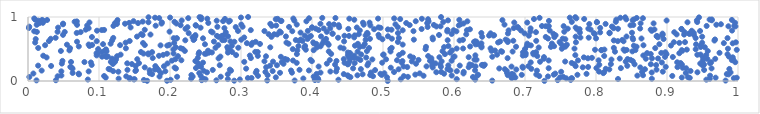
| Category | Series 0 |
|---|---|
| 0.5066446792424749 | 0.001 |
| 0.7273390573005676 | 0.002 |
| 0.16776289051425142 | 0.003 |
| 0.19573983436743414 | 0.004 |
| 0.29044077627068376 | 0.005 |
| 0.6538460944912292 | 0.006 |
| 0.9825186861008528 | 0.007 |
| 0.3755370394606483 | 0.008 |
| 0.33699287710838477 | 0.009 |
| 0.01194620038154881 | 0.01 |
| 0.2653430936081671 | 0.011 |
| 0.03927846956264036 | 0.012 |
| 0.24469687878315727 | 0.013 |
| 0.746077350351974 | 0.014 |
| 0.40414652269213147 | 0.015 |
| 0.16319884785727035 | 0.016 |
| 0.7644951884384839 | 0.017 |
| 0.4089043672790691 | 0.018 |
| 0.2008756063524304 | 0.019 |
| 0.4372411225565269 | 0.02 |
| 0.9554166714827125 | 0.021 |
| 0.6298650176584266 | 0.022 |
| 0.08425860920061146 | 0.023 |
| 0.2983270029154491 | 0.024 |
| 0.14890320591030903 | 0.025 |
| 0.2500699769613106 | 0.026 |
| 0.5250334935101109 | 0.027 |
| 0.15013411242525554 | 0.028 |
| 0.6038917195047535 | 0.029 |
| 0.2814680900191767 | 0.03 |
| 0.8310206023150317 | 0.031 |
| 0.24759962955820736 | 0.032 |
| 0.14331621828558905 | 0.033 |
| 0.9601874281692051 | 0.034 |
| 0.8786223196855039 | 0.035 |
| 0.2297935473833338 | 0.036 |
| 0.1276690582118598 | 0.037 |
| 0.40849363384227866 | 0.038 |
| 0.38779549427072124 | 0.039 |
| 0.4062977833347422 | 0.04 |
| 0.7663090196332922 | 0.041 |
| 0.7581445398009405 | 0.042 |
| 0.7652250684037771 | 0.043 |
| 0.9941757080983294 | 0.044 |
| 0.1435952344699306 | 0.045 |
| 0.30968935304764267 | 0.046 |
| 0.31484541788683973 | 0.047 |
| 0.6811626801923677 | 0.048 |
| 0.9320745420388422 | 0.049 |
| 0.681727538317934 | 0.05 |
| 0.9982168928025423 | 0.051 |
| 0.9684672303360656 | 0.052 |
| 0.10945854293022284 | 0.053 |
| 0.9208655562788824 | 0.054 |
| 0.6864111518455834 | 0.055 |
| 0.7493346206057587 | 0.056 |
| 0.3490254090131648 | 0.057 |
| 0.505668191982686 | 0.058 |
| 0.9295750750005789 | 0.059 |
| 0.45414590903095786 | 0.06 |
| 0.6839381165811463 | 0.061 |
| 0.6267160099842705 | 0.062 |
| 0.001868504858891673 | 0.063 |
| 0.7539017172345731 | 0.064 |
| 0.5350890880030333 | 0.065 |
| 0.210011848797527 | 0.066 |
| 0.27146671039300196 | 0.067 |
| 0.40237011536257916 | 0.068 |
| 0.23190699428273653 | 0.069 |
| 0.1852315613828701 | 0.07 |
| 0.7323137278850017 | 0.071 |
| 0.4516108924789073 | 0.072 |
| 0.13840816620710217 | 0.073 |
| 0.04176832630698213 | 0.074 |
| 0.48592455643939203 | 0.075 |
| 0.5292764622721047 | 0.076 |
| 0.7200453761332853 | 0.077 |
| 0.10723330296901679 | 0.078 |
| 0.9074343015615656 | 0.079 |
| 0.32391550002540737 | 0.08 |
| 0.2433040251883608 | 0.081 |
| 0.5571159827588731 | 0.082 |
| 0.960668770312429 | 0.083 |
| 0.85827427852476 | 0.084 |
| 0.5967517667747605 | 0.085 |
| 0.04701324106146021 | 0.086 |
| 0.633065654290535 | 0.087 |
| 0.4501860503261651 | 0.088 |
| 0.4639756894507969 | 0.089 |
| 0.8662247177588303 | 0.09 |
| 0.337540017594683 | 0.091 |
| 0.6757094214583751 | 0.092 |
| 0.48202335819765774 | 0.093 |
| 0.23013587788506018 | 0.094 |
| 0.49821351323179286 | 0.095 |
| 0.6954477470842665 | 0.096 |
| 0.7738396002152772 | 0.097 |
| 0.6338358389105777 | 0.098 |
| 0.7404611887689406 | 0.099 |
| 0.5454860753634302 | 0.1 |
| 0.6836571747971025 | 0.101 |
| 0.7159278307020469 | 0.102 |
| 0.9867426610185427 | 0.103 |
| 0.07177576262022567 | 0.104 |
| 0.4712785955822376 | 0.105 |
| 0.2814252874871509 | 0.106 |
| 0.17472905914089398 | 0.107 |
| 0.44476772845468016 | 0.108 |
| 0.9842635687466981 | 0.109 |
| 0.40646540025405153 | 0.11 |
| 0.6815416020776138 | 0.111 |
| 0.7866616285747374 | 0.112 |
| 0.4963366398540644 | 0.113 |
| 0.586090793669019 | 0.114 |
| 0.07135853077114496 | 0.115 |
| 0.7426915772376004 | 0.116 |
| 0.007556343038463531 | 0.117 |
| 0.613330974524838 | 0.118 |
| 0.5516626523036803 | 0.119 |
| 0.17163072117110567 | 0.12 |
| 0.5019431785040644 | 0.121 |
| 0.18712211110612864 | 0.122 |
| 0.8102342820954125 | 0.123 |
| 0.2412313967484927 | 0.124 |
| 0.9265096778069871 | 0.125 |
| 0.06285966942617549 | 0.126 |
| 0.6746241008472221 | 0.127 |
| 0.35497160644935477 | 0.128 |
| 0.3207902765297074 | 0.129 |
| 0.37179267001185523 | 0.13 |
| 0.4120032878512333 | 0.131 |
| 0.48305721678366087 | 0.132 |
| 0.8784924606128037 | 0.133 |
| 0.9895399989996465 | 0.134 |
| 0.2521100520315289 | 0.135 |
| 0.942860178151137 | 0.136 |
| 0.5750911588996925 | 0.137 |
| 0.8114540992827627 | 0.138 |
| 0.8649062898015286 | 0.139 |
| 0.5155718317737858 | 0.14 |
| 0.33438760726540373 | 0.141 |
| 0.5818978576536081 | 0.142 |
| 0.6136898279331996 | 0.143 |
| 0.750943592186474 | 0.144 |
| 0.1272373578906416 | 0.145 |
| 0.8940866545384452 | 0.146 |
| 0.804229874309525 | 0.147 |
| 0.42591316590142747 | 0.148 |
| 0.43404503386161697 | 0.149 |
| 0.08544191655433997 | 0.15 |
| 0.04696007283083392 | 0.151 |
| 0.19343872847261678 | 0.152 |
| 0.6040043836877006 | 0.153 |
| 0.11993906018542522 | 0.154 |
| 0.34458138866570387 | 0.155 |
| 0.15122878641881565 | 0.156 |
| 0.9331581704927355 | 0.157 |
| 0.32197307523152374 | 0.158 |
| 0.6742840137181568 | 0.159 |
| 0.24739693596285572 | 0.16 |
| 0.2859453511533846 | 0.161 |
| 0.7168477036713004 | 0.162 |
| 0.01925896798750537 | 0.163 |
| 0.3704866244195856 | 0.164 |
| 0.3956600866915918 | 0.165 |
| 0.594998570896817 | 0.166 |
| 0.6296578300003991 | 0.167 |
| 0.1712404417608402 | 0.168 |
| 0.1520776758373229 | 0.169 |
| 0.18379822052206662 | 0.17 |
| 0.48884921285463645 | 0.171 |
| 0.9522967789079255 | 0.172 |
| 0.2602061402057544 | 0.173 |
| 0.1400647880080479 | 0.174 |
| 0.3824017976276288 | 0.175 |
| 0.5933210565499525 | 0.176 |
| 0.8852476092404387 | 0.177 |
| 0.28428494951463756 | 0.178 |
| 0.17852444796546463 | 0.179 |
| 0.6877591771878087 | 0.18 |
| 0.8187317726430771 | 0.181 |
| 0.1153081889796036 | 0.182 |
| 0.5220120245135024 | 0.183 |
| 0.8689772737522852 | 0.184 |
| 0.6715807684863099 | 0.185 |
| 0.4688374046488979 | 0.186 |
| 0.5908815848664133 | 0.187 |
| 0.9878003045750982 | 0.188 |
| 0.11355861888170882 | 0.189 |
| 0.70896384214218 | 0.19 |
| 0.8138328351109784 | 0.191 |
| 0.06272512630599325 | 0.192 |
| 0.30725301568074914 | 0.193 |
| 0.4351104220692462 | 0.194 |
| 0.20838528188316263 | 0.195 |
| 0.663755923534183 | 0.196 |
| 0.962749520584084 | 0.197 |
| 0.45788233173377846 | 0.198 |
| 0.9270493445339129 | 0.199 |
| 0.733333602307708 | 0.2 |
| 0.8350410933890694 | 0.201 |
| 0.8005650457024209 | 0.202 |
| 0.2366015330946054 | 0.203 |
| 0.18103554403813849 | 0.204 |
| 0.1809747305432292 | 0.205 |
| 0.9221145018574771 | 0.206 |
| 0.6969911628328058 | 0.207 |
| 0.5109477257106325 | 0.208 |
| 0.061569410516785994 | 0.209 |
| 0.20646960958938487 | 0.21 |
| 0.570022856068835 | 0.211 |
| 0.8624011761005338 | 0.212 |
| 0.1644345430552221 | 0.213 |
| 0.7813440898352819 | 0.214 |
| 0.33545369919358625 | 0.215 |
| 0.6207332259572415 | 0.216 |
| 0.914729628943939 | 0.217 |
| 0.5341717325119572 | 0.218 |
| 0.7889229007456359 | 0.219 |
| 0.0596394001056737 | 0.22 |
| 0.898248034352133 | 0.221 |
| 0.5815760674291047 | 0.222 |
| 0.243662697134847 | 0.223 |
| 0.6964887699904313 | 0.224 |
| 0.681012325205352 | 0.225 |
| 0.4093524436340923 | 0.226 |
| 0.5289394264803136 | 0.227 |
| 0.5612949333140319 | 0.228 |
| 0.6303574126336502 | 0.229 |
| 0.19143523304159593 | 0.23 |
| 0.7048009663798915 | 0.231 |
| 0.7713231227124417 | 0.232 |
| 0.17933531638225375 | 0.233 |
| 0.1516897377780534 | 0.234 |
| 0.032553593693781524 | 0.235 |
| 0.6419075141974172 | 0.236 |
| 0.8440700741929386 | 0.237 |
| 0.2414340603918601 | 0.238 |
| 0.3408967323225641 | 0.239 |
| 0.014287832474959683 | 0.24 |
| 0.6081033115672027 | 0.241 |
| 0.5691771487525955 | 0.242 |
| 0.950081062320698 | 0.243 |
| 0.5919836605650953 | 0.244 |
| 0.47808729011179396 | 0.245 |
| 0.35067770140061805 | 0.246 |
| 0.2700392738551003 | 0.247 |
| 0.6251596722205154 | 0.248 |
| 0.8847465459770916 | 0.249 |
| 0.6392556139248524 | 0.25 |
| 0.08968975944646451 | 0.251 |
| 0.6405914966803695 | 0.252 |
| 0.8045906233853732 | 0.253 |
| 0.921101703102941 | 0.254 |
| 0.6433011156156342 | 0.255 |
| 0.43247073897172306 | 0.256 |
| 0.9522201913490459 | 0.257 |
| 0.5806512872119546 | 0.258 |
| 0.6219515962119994 | 0.259 |
| 0.45022915069488956 | 0.26 |
| 0.8543453775848828 | 0.261 |
| 0.8772473672455228 | 0.262 |
| 0.769413123429886 | 0.263 |
| 0.8209566114131153 | 0.264 |
| 0.14633286901343445 | 0.265 |
| 0.1195658573668652 | 0.266 |
| 0.4512269323418603 | 0.267 |
| 0.5704154062016018 | 0.268 |
| 0.35988230678578903 | 0.269 |
| 0.546541101680259 | 0.27 |
| 0.4209100487310875 | 0.271 |
| 0.04767360420426836 | 0.272 |
| 0.9468602472957025 | 0.273 |
| 0.19646253762743682 | 0.274 |
| 0.5739219097161354 | 0.275 |
| 0.13977040086836456 | 0.276 |
| 0.47941685263915756 | 0.277 |
| 0.9606022570169229 | 0.278 |
| 0.15632462148216597 | 0.279 |
| 0.4601046823266567 | 0.28 |
| 0.9191190232642124 | 0.281 |
| 0.7658126154613926 | 0.282 |
| 0.2389434195497082 | 0.283 |
| 0.37844482076345876 | 0.284 |
| 0.44584275057780787 | 0.285 |
| 0.4988572381647429 | 0.286 |
| 0.2464971539608115 | 0.287 |
| 0.5262076917837041 | 0.288 |
| 0.892793550522042 | 0.289 |
| 0.08856863803156345 | 0.29 |
| 0.70806515356506 | 0.291 |
| 0.9143658204339611 | 0.292 |
| 0.9621728372608048 | 0.293 |
| 0.9960698235111503 | 0.294 |
| 0.35749557488936246 | 0.295 |
| 0.07950077107866482 | 0.296 |
| 0.06061979462900813 | 0.297 |
| 0.11670403781150485 | 0.298 |
| 0.3045563427930029 | 0.299 |
| 0.12259798532788191 | 0.3 |
| 0.7212221894134042 | 0.301 |
| 0.8418479505390819 | 0.302 |
| 0.34511009314675867 | 0.303 |
| 0.7566050380898666 | 0.304 |
| 0.45286804870895214 | 0.305 |
| 0.5406781278030168 | 0.306 |
| 0.5826243597877689 | 0.307 |
| 0.3330208292842589 | 0.308 |
| 0.85194386071405 | 0.309 |
| 0.3998705838500276 | 0.31 |
| 0.5273628197172201 | 0.311 |
| 0.23573183690154753 | 0.312 |
| 0.4344744657366546 | 0.313 |
| 0.04851689523736358 | 0.314 |
| 0.5662017600523298 | 0.315 |
| 0.9503949983854509 | 0.316 |
| 0.596605208253426 | 0.317 |
| 0.20282667267578558 | 0.318 |
| 0.5683064713816885 | 0.319 |
| 0.3732948255809836 | 0.32 |
| 0.7333465014255738 | 0.321 |
| 0.7746264754653577 | 0.322 |
| 0.8036892668926024 | 0.323 |
| 0.21599065243435833 | 0.324 |
| 0.5197710565505321 | 0.325 |
| 0.9914006195148193 | 0.326 |
| 0.42502262046447514 | 0.327 |
| 0.46815499099689695 | 0.328 |
| 0.5500569167921423 | 0.329 |
| 0.8488048600118625 | 0.33 |
| 0.3979932286620047 | 0.331 |
| 0.36518093670884166 | 0.332 |
| 0.631711932076234 | 0.333 |
| 0.6288532331101565 | 0.334 |
| 0.8217588864818838 | 0.335 |
| 0.993218093467936 | 0.336 |
| 0.4850030429812868 | 0.337 |
| 0.12405078749246212 | 0.338 |
| 0.5043687549939835 | 0.339 |
| 0.20760321352131483 | 0.34 |
| 0.1539045424151334 | 0.341 |
| 0.44480001922601586 | 0.342 |
| 0.84450127498653 | 0.343 |
| 0.36212133634510524 | 0.344 |
| 0.9568628698325279 | 0.345 |
| 0.9678955611914791 | 0.346 |
| 0.7263777537082219 | 0.347 |
| 0.8702254092346597 | 0.348 |
| 0.11836486514650013 | 0.349 |
| 0.46442847436865753 | 0.35 |
| 0.8334703916891926 | 0.351 |
| 0.8873911960996209 | 0.352 |
| 0.26841919147271986 | 0.353 |
| 0.8788172761675963 | 0.354 |
| 0.7886220926703424 | 0.355 |
| 0.5680913758141868 | 0.356 |
| 0.6754802089642005 | 0.357 |
| 0.3139108536976599 | 0.358 |
| 0.17565987208567213 | 0.359 |
| 0.45506709994818995 | 0.36 |
| 0.2391959613614162 | 0.361 |
| 0.7942755109107145 | 0.362 |
| 0.4525073771246628 | 0.363 |
| 0.459331136686577 | 0.364 |
| 0.5425893783935 | 0.365 |
| 0.9507018681509537 | 0.366 |
| 0.47633946495215074 | 0.367 |
| 0.02622106495484866 | 0.368 |
| 0.7829025353242586 | 0.369 |
| 0.9925743818068059 | 0.37 |
| 0.5794311765411575 | 0.371 |
| 0.620690556017898 | 0.372 |
| 0.7267385514119467 | 0.373 |
| 0.599271991842604 | 0.374 |
| 0.9082086300006845 | 0.375 |
| 0.1103985387754296 | 0.376 |
| 0.8971627830533135 | 0.377 |
| 0.3561977000773857 | 0.378 |
| 0.6539345759486037 | 0.379 |
| 0.10430010258838751 | 0.38 |
| 0.2709918451830782 | 0.381 |
| 0.9871211816144527 | 0.382 |
| 0.6007798196379758 | 0.383 |
| 0.11236692617642985 | 0.384 |
| 0.5383461511094119 | 0.385 |
| 0.335209448752566 | 0.386 |
| 0.1254013199561168 | 0.387 |
| 0.21128909309891908 | 0.388 |
| 0.7172613695538003 | 0.389 |
| 0.5636043959136631 | 0.39 |
| 0.8115753751103071 | 0.391 |
| 0.32370503920134497 | 0.392 |
| 0.10938295902384276 | 0.393 |
| 0.18449656456134012 | 0.394 |
| 0.021502578598551647 | 0.395 |
| 0.45939662215822064 | 0.396 |
| 0.6969220389667395 | 0.397 |
| 0.3124681746025437 | 0.398 |
| 0.8666312701246698 | 0.399 |
| 0.09671689879041401 | 0.4 |
| 0.6300950666916046 | 0.401 |
| 0.45048813288614287 | 0.402 |
| 0.7008071752375954 | 0.403 |
| 0.7708782765061936 | 0.404 |
| 0.29309593666858 | 0.405 |
| 0.522696556209505 | 0.406 |
| 0.9552862128476398 | 0.407 |
| 0.1903763983659117 | 0.408 |
| 0.5002804590395296 | 0.409 |
| 0.9426982081996127 | 0.41 |
| 0.660693846487252 | 0.411 |
| 0.13043840567751053 | 0.412 |
| 0.9473279233107347 | 0.413 |
| 0.5008388999094757 | 0.414 |
| 0.4693322966059814 | 0.415 |
| 0.7119351727547131 | 0.416 |
| 0.1694368932719239 | 0.417 |
| 0.9852090252090192 | 0.418 |
| 0.899342921498474 | 0.419 |
| 0.5872632688645245 | 0.42 |
| 0.37868613087954395 | 0.421 |
| 0.8770766560255401 | 0.422 |
| 0.4269897335854814 | 0.423 |
| 0.24032351279643394 | 0.424 |
| 0.24900490179464974 | 0.425 |
| 0.1957935349456118 | 0.426 |
| 0.2510172823804899 | 0.427 |
| 0.16272473736093518 | 0.428 |
| 0.7137839319505767 | 0.429 |
| 0.20495921350201063 | 0.43 |
| 0.16937937220266075 | 0.431 |
| 0.09864310626732842 | 0.432 |
| 0.7010456714135693 | 0.433 |
| 0.9173570319981085 | 0.434 |
| 0.09655664081299209 | 0.435 |
| 0.8719624418855474 | 0.436 |
| 0.45351885570544004 | 0.437 |
| 0.7116031697381482 | 0.438 |
| 0.8919465124159315 | 0.439 |
| 0.9739628781039924 | 0.44 |
| 0.5277842124858834 | 0.441 |
| 0.2546983301195348 | 0.442 |
| 0.5945031210865009 | 0.443 |
| 0.28157089795834456 | 0.444 |
| 0.450614985495727 | 0.445 |
| 0.25900657681168815 | 0.446 |
| 0.6971154893891929 | 0.447 |
| 0.2410392686866799 | 0.448 |
| 0.8977108761623659 | 0.449 |
| 0.7156003317881481 | 0.45 |
| 0.17478491229459903 | 0.451 |
| 0.28764575085421495 | 0.452 |
| 0.15910328885588698 | 0.453 |
| 0.3235077957092869 | 0.454 |
| 0.320079006100465 | 0.455 |
| 0.1048508875564077 | 0.456 |
| 0.6677021468547899 | 0.457 |
| 0.8267440096931205 | 0.458 |
| 0.4642790464250731 | 0.459 |
| 0.6825668398902056 | 0.46 |
| 0.5106150439428105 | 0.461 |
| 0.4236445395337748 | 0.462 |
| 0.8512134154667326 | 0.463 |
| 0.11057598100304655 | 0.464 |
| 0.6662908511890674 | 0.465 |
| 0.5838407497980526 | 0.466 |
| 0.4773643481849814 | 0.467 |
| 0.9574190526378564 | 0.468 |
| 0.04631616761796142 | 0.469 |
| 0.22089294938481263 | 0.47 |
| 0.6528962025497647 | 0.471 |
| 0.9216054823423214 | 0.472 |
| 0.8404677969427811 | 0.473 |
| 0.25358234802549173 | 0.474 |
| 0.10853351393526844 | 0.475 |
| 0.65772819761297 | 0.476 |
| 0.3792629661519469 | 0.477 |
| 0.5971326434626242 | 0.478 |
| 0.05833111506383715 | 0.479 |
| 0.8075235650103707 | 0.48 |
| 0.4023549229476715 | 0.481 |
| 0.9207639135065923 | 0.482 |
| 0.8555454949718144 | 0.483 |
| 0.8075942084135725 | 0.484 |
| 0.843169067614594 | 0.485 |
| 0.2841901225731941 | 0.486 |
| 0.9982704377965762 | 0.487 |
| 0.7986076351192877 | 0.488 |
| 0.3912697029422829 | 0.489 |
| 0.9279168998225962 | 0.49 |
| 0.8118322479957968 | 0.491 |
| 0.8388984326532466 | 0.492 |
| 0.2047867546837956 | 0.493 |
| 0.10986579415154996 | 0.494 |
| 0.2818312354390693 | 0.495 |
| 0.9404275628969981 | 0.496 |
| 0.5599449157431269 | 0.497 |
| 0.37292464849916107 | 0.498 |
| 0.0988176734520767 | 0.499 |
| 0.7000639933524342 | 0.5 |
| 0.5104366395296618 | 0.501 |
| 0.21794060781143565 | 0.502 |
| 0.5108284891982623 | 0.503 |
| 0.7518950515249112 | 0.504 |
| 0.9858261252851432 | 0.505 |
| 0.7696893184967353 | 0.506 |
| 0.6038216495060218 | 0.507 |
| 0.6128274446559818 | 0.508 |
| 0.4445097670322318 | 0.509 |
| 0.6514915526697382 | 0.51 |
| 0.1378339865974706 | 0.511 |
| 0.2149666439021013 | 0.512 |
| 0.0592140259312226 | 0.513 |
| 0.8834343571508741 | 0.514 |
| 0.48026343140178507 | 0.515 |
| 0.014376239897371912 | 0.516 |
| 0.8251316845793278 | 0.517 |
| 0.5122779555976011 | 0.518 |
| 0.2640799391602352 | 0.519 |
| 0.296183591233002 | 0.52 |
| 0.3892000427740181 | 0.521 |
| 0.4400404425353007 | 0.522 |
| 0.7192963721731963 | 0.523 |
| 0.4067565253343154 | 0.524 |
| 0.6387491690961468 | 0.525 |
| 0.3412318508261678 | 0.526 |
| 0.20812704877031896 | 0.527 |
| 0.9532850696138464 | 0.528 |
| 0.2806945754133896 | 0.529 |
| 0.5860754056911964 | 0.53 |
| 0.9475199583394193 | 0.531 |
| 0.46718995151576814 | 0.532 |
| 0.7364757289139662 | 0.533 |
| 0.5605694726882207 | 0.534 |
| 0.6874152834413799 | 0.535 |
| 0.8571895278680425 | 0.536 |
| 0.7553561259611551 | 0.537 |
| 0.7569982725131534 | 0.538 |
| 0.6227363414275428 | 0.539 |
| 0.07156598671813019 | 0.54 |
| 0.6386743869684545 | 0.541 |
| 0.41202247240216483 | 0.542 |
| 0.47215441890281695 | 0.543 |
| 0.7410086701542417 | 0.544 |
| 0.38091263764495875 | 0.545 |
| 0.5921545795388413 | 0.546 |
| 0.08668468647937622 | 0.547 |
| 0.39027577297520033 | 0.548 |
| 0.2870208212578307 | 0.549 |
| 0.7026228219374553 | 0.55 |
| 0.8533678868246157 | 0.551 |
| 0.46048885802010464 | 0.552 |
| 0.1961303030773922 | 0.553 |
| 0.9055991809104516 | 0.554 |
| 0.9478487551458176 | 0.555 |
| 0.7082451250571582 | 0.556 |
| 0.18671248741992663 | 0.557 |
| 0.8668408633063415 | 0.558 |
| 0.0240918999709393 | 0.559 |
| 0.12971633477619438 | 0.56 |
| 0.2679626234139303 | 0.561 |
| 0.1645093972293803 | 0.562 |
| 0.09037022806640715 | 0.563 |
| 0.19880842298879053 | 0.564 |
| 0.31455164636334976 | 0.565 |
| 0.42346603443086617 | 0.566 |
| 0.7589865786126695 | 0.567 |
| 0.05487853410874244 | 0.568 |
| 0.5277218113461639 | 0.569 |
| 0.08546069676986767 | 0.57 |
| 0.7514257900161805 | 0.571 |
| 0.6303679303949626 | 0.572 |
| 0.9409286002593844 | 0.573 |
| 0.24923295843425441 | 0.574 |
| 0.8892410226338696 | 0.575 |
| 0.10569548302526965 | 0.576 |
| 0.6334929520069955 | 0.577 |
| 0.47428565037645876 | 0.578 |
| 0.3267806154556595 | 0.579 |
| 0.4060707784060249 | 0.58 |
| 0.46464845275024724 | 0.581 |
| 0.36695800152496283 | 0.582 |
| 0.11637615158746017 | 0.583 |
| 0.7032100265264175 | 0.584 |
| 0.7379257060365407 | 0.585 |
| 0.4146844624096738 | 0.586 |
| 0.4027562436181724 | 0.587 |
| 0.6385835391306091 | 0.588 |
| 0.9925599761367779 | 0.589 |
| 0.42191014483791445 | 0.59 |
| 0.3083233007977212 | 0.591 |
| 0.9800614015120247 | 0.592 |
| 0.162039215347197 | 0.593 |
| 0.20590552233644777 | 0.594 |
| 0.6306310966396628 | 0.595 |
| 0.9173455226049817 | 0.596 |
| 0.31610672326865563 | 0.597 |
| 0.9494505701662797 | 0.598 |
| 0.13749399289646325 | 0.599 |
| 0.3640398785106119 | 0.6 |
| 0.010103171805210587 | 0.601 |
| 0.6620931347988646 | 0.602 |
| 0.40180448080279696 | 0.603 |
| 0.9969855884794759 | 0.604 |
| 0.7717498973050627 | 0.605 |
| 0.90966607746958 | 0.606 |
| 0.9253689393633999 | 0.607 |
| 0.7487534129786515 | 0.608 |
| 0.6757372495109549 | 0.609 |
| 0.5209455377834338 | 0.61 |
| 0.6282350589587822 | 0.611 |
| 0.32063589024495454 | 0.612 |
| 0.29069483748273917 | 0.613 |
| 0.06904456864456499 | 0.614 |
| 0.631695731223399 | 0.615 |
| 0.26186532146243435 | 0.616 |
| 0.6648965211934418 | 0.617 |
| 0.2852005709960299 | 0.618 |
| 0.4451915033050856 | 0.619 |
| 0.6296515977076702 | 0.62 |
| 0.8387850137349616 | 0.621 |
| 0.09678053805679299 | 0.622 |
| 0.8307225376319527 | 0.623 |
| 0.02951009955544248 | 0.624 |
| 0.14321797662857982 | 0.625 |
| 0.38668362125380984 | 0.626 |
| 0.7158133663510954 | 0.627 |
| 0.41663653358654584 | 0.628 |
| 0.6835072443393414 | 0.629 |
| 0.3817925900532533 | 0.63 |
| 0.675428909751682 | 0.631 |
| 0.966830018135556 | 0.632 |
| 0.6079021802141189 | 0.633 |
| 0.8250788036297382 | 0.634 |
| 0.11847287092317038 | 0.635 |
| 0.22154351502280922 | 0.636 |
| 0.5910803102066067 | 0.637 |
| 0.27370334025487275 | 0.638 |
| 0.2767781950360636 | 0.639 |
| 0.37718137176514455 | 0.64 |
| 0.2331933988981868 | 0.641 |
| 0.8369754713485545 | 0.642 |
| 0.6126211320184334 | 0.643 |
| 0.4755704734331778 | 0.644 |
| 0.3003727445932929 | 0.645 |
| 0.5434529598482042 | 0.646 |
| 0.6727227477538796 | 0.647 |
| 0.38423504345579007 | 0.648 |
| 0.9676021928359835 | 0.649 |
| 0.8522564474916157 | 0.65 |
| 0.5702246197021326 | 0.651 |
| 0.4992516917109714 | 0.652 |
| 0.7567749379597843 | 0.653 |
| 0.2342098207395631 | 0.654 |
| 0.01088345964922166 | 0.655 |
| 0.895158891249189 | 0.656 |
| 0.3936916279782048 | 0.657 |
| 0.4197324549129351 | 0.658 |
| 0.48165430852821545 | 0.659 |
| 0.03207755692470149 | 0.66 |
| 0.512486880327389 | 0.661 |
| 0.753088011705802 | 0.662 |
| 0.7324204150444108 | 0.663 |
| 0.8640593657763392 | 0.664 |
| 0.20909900039089435 | 0.665 |
| 0.8000611541863627 | 0.666 |
| 0.24648827217071545 | 0.667 |
| 0.2097032183178752 | 0.668 |
| 0.2051848636916319 | 0.669 |
| 0.9852367567166609 | 0.67 |
| 0.9403839695191979 | 0.671 |
| 0.5223301912768668 | 0.672 |
| 0.12007735318383428 | 0.673 |
| 0.8515364620494638 | 0.674 |
| 0.03895467540353026 | 0.675 |
| 0.4367052710917013 | 0.676 |
| 0.7897360477884243 | 0.677 |
| 0.5698896073053104 | 0.678 |
| 0.7780737972993697 | 0.679 |
| 0.30449494402642874 | 0.68 |
| 0.45945486036253624 | 0.681 |
| 0.3953956698442542 | 0.682 |
| 0.8871686020355263 | 0.683 |
| 0.23174215095772288 | 0.684 |
| 0.4946458994667575 | 0.685 |
| 0.7412528206819098 | 0.686 |
| 0.0900617512503682 | 0.687 |
| 0.7292488591957248 | 0.688 |
| 0.26867141394349814 | 0.689 |
| 0.3429125223234537 | 0.69 |
| 0.6396436368051692 | 0.691 |
| 0.9495184650070383 | 0.692 |
| 0.7713747453054982 | 0.693 |
| 0.15353236017167093 | 0.694 |
| 0.8429646902475405 | 0.695 |
| 0.3632785380513036 | 0.696 |
| 0.4127195907545206 | 0.697 |
| 0.28172769509414064 | 0.698 |
| 0.5069710618427877 | 0.699 |
| 0.8853489709455383 | 0.7 |
| 0.2356600543102182 | 0.701 |
| 0.886068719642708 | 0.702 |
| 0.3983860161028395 | 0.703 |
| 0.45214230461073257 | 0.704 |
| 0.2661475093198402 | 0.705 |
| 0.27322238168228696 | 0.706 |
| 0.4457397942633837 | 0.707 |
| 0.7053620623035985 | 0.708 |
| 0.3897326453481389 | 0.709 |
| 0.6493898359147532 | 0.71 |
| 0.6554499184291364 | 0.711 |
| 0.47547513338931424 | 0.712 |
| 0.46011418631106094 | 0.713 |
| 0.7431301842951286 | 0.714 |
| 0.656470206229124 | 0.715 |
| 0.8933558242343812 | 0.716 |
| 0.23571357732379916 | 0.717 |
| 0.16144392120855589 | 0.718 |
| 0.5788959132836556 | 0.719 |
| 0.9378707987341991 | 0.72 |
| 0.04932048882972695 | 0.721 |
| 0.4936693167117999 | 0.722 |
| 0.2768547178485904 | 0.723 |
| 0.8938671203881909 | 0.724 |
| 0.9241262480781502 | 0.725 |
| 0.1725118860738667 | 0.726 |
| 0.3510690417010325 | 0.727 |
| 0.9135781160550515 | 0.728 |
| 0.6172512395573516 | 0.729 |
| 0.34673661238165365 | 0.73 |
| 0.46584774162345255 | 0.731 |
| 0.33894318514559274 | 0.732 |
| 0.15940201806573695 | 0.733 |
| 0.7981964066007136 | 0.734 |
| 0.5967713526562277 | 0.735 |
| 0.9318336695859487 | 0.736 |
| 0.4784628865682382 | 0.737 |
| 0.7399389326054668 | 0.738 |
| 0.4290098719048471 | 0.739 |
| 0.8936300164515615 | 0.74 |
| 0.4288873358716305 | 0.741 |
| 0.9310299171687532 | 0.742 |
| 0.6759724060237858 | 0.743 |
| 0.6993573496576099 | 0.744 |
| 0.6514813520251682 | 0.745 |
| 0.8191134864851277 | 0.746 |
| 0.796979448080155 | 0.747 |
| 0.22630007238094108 | 0.748 |
| 0.5210836444857792 | 0.749 |
| 0.6384982129311693 | 0.75 |
| 0.06861522870402281 | 0.751 |
| 0.4777006487785781 | 0.752 |
| 0.9376296149845684 | 0.753 |
| 0.8506992163074791 | 0.754 |
| 0.8191192756532425 | 0.755 |
| 0.38391052689298055 | 0.756 |
| 0.7773154423867824 | 0.757 |
| 0.35608296159852215 | 0.758 |
| 0.2600101386047414 | 0.759 |
| 0.8058329818234126 | 0.76 |
| 0.2785488426276299 | 0.761 |
| 0.9102500155758457 | 0.762 |
| 0.7154463573386831 | 0.763 |
| 0.07419436356789544 | 0.764 |
| 0.9245484776002922 | 0.765 |
| 0.0517573661356141 | 0.766 |
| 0.012503921182657751 | 0.767 |
| 0.42084132372349825 | 0.768 |
| 0.04163193474263116 | 0.769 |
| 0.7553216435511947 | 0.77 |
| 0.19940567823758715 | 0.771 |
| 0.7076424154305482 | 0.772 |
| 0.2578993683734777 | 0.773 |
| 0.3545537807570872 | 0.774 |
| 0.5904949437654606 | 0.775 |
| 0.603412576559219 | 0.776 |
| 0.008772772151369623 | 0.777 |
| 0.37221081797985356 | 0.778 |
| 0.5429439800457956 | 0.779 |
| 0.3330153400036874 | 0.78 |
| 0.9465679771866011 | 0.781 |
| 0.2957831520974824 | 0.782 |
| 0.3941422025987332 | 0.783 |
| 0.8785779252091145 | 0.784 |
| 0.9348734974209147 | 0.785 |
| 0.09716219883607835 | 0.786 |
| 0.7348547469091115 | 0.787 |
| 0.9916476503308851 | 0.788 |
| 0.6943538029217688 | 0.789 |
| 0.46735221371670754 | 0.79 |
| 0.6769254288321694 | 0.791 |
| 0.5277197294653793 | 0.792 |
| 0.5993979245934294 | 0.793 |
| 0.618218587094239 | 0.794 |
| 0.3137678688719149 | 0.795 |
| 0.10389399080740047 | 0.796 |
| 0.4093292093380616 | 0.797 |
| 0.10724454300334729 | 0.798 |
| 0.59078323794359 | 0.799 |
| 0.16443209408800674 | 0.8 |
| 0.5119663280110821 | 0.801 |
| 0.08136626009936765 | 0.802 |
| 0.8770620396599147 | 0.803 |
| 0.7924646750354665 | 0.804 |
| 0.8823289283263877 | 0.805 |
| 0.5068067263382575 | 0.806 |
| 0.7736215863922756 | 0.807 |
| 0.6224067130642573 | 0.808 |
| 0.4874749054453744 | 0.809 |
| 0.7769228445897695 | 0.81 |
| 0.9206082004500004 | 0.811 |
| 0.5543866458098728 | 0.812 |
| 0.9203238173089932 | 0.813 |
| 0.451172923438219 | 0.814 |
| 0.22184172365786636 | 0.815 |
| 0.8309451473634604 | 0.816 |
| 0.7602367644052147 | 0.817 |
| 0.7892278441570306 | 0.818 |
| 0.40528322717838616 | 0.819 |
| 0.8621507006939602 | 0.82 |
| 0.4166063137189232 | 0.821 |
| 0.7078682982256383 | 0.822 |
| 0.0854242472547111 | 0.823 |
| 0.4256142101860425 | 0.824 |
| 0.8249564121448771 | 0.825 |
| 0.2766669558578322 | 0.826 |
| 0.6842102104800248 | 0.827 |
| 0.0012434940298207131 | 0.828 |
| 0.8059410279996139 | 0.829 |
| 0.6905639717516298 | 0.83 |
| 0.49652010991648743 | 0.831 |
| 0.40012491585925447 | 0.832 |
| 0.24309225776159593 | 0.833 |
| 0.04237443001385388 | 0.834 |
| 0.7714085749162506 | 0.835 |
| 0.46312433641651085 | 0.836 |
| 0.1445471568349581 | 0.837 |
| 0.4936272014567018 | 0.838 |
| 0.40008015432133914 | 0.839 |
| 0.43824870507098146 | 0.84 |
| 0.22467498754065762 | 0.841 |
| 0.5208467308183905 | 0.842 |
| 0.2925869483787944 | 0.843 |
| 0.5628587002617901 | 0.844 |
| 0.3676892658006985 | 0.845 |
| 0.6895225953336891 | 0.846 |
| 0.2667378291989291 | 0.847 |
| 0.3022548637087361 | 0.848 |
| 0.0017774787426869665 | 0.849 |
| 0.7326566295196102 | 0.85 |
| 0.8224707817397248 | 0.851 |
| 0.5751792056415046 | 0.852 |
| 0.9964316533075338 | 0.853 |
| 0.5810878496616094 | 0.854 |
| 0.9865110593762565 | 0.855 |
| 0.7292516394582433 | 0.856 |
| 0.7544383100746475 | 0.857 |
| 0.7334912555911 | 0.858 |
| 0.7239194208748296 | 0.859 |
| 0.9558350440413559 | 0.86 |
| 0.12034278850375024 | 0.861 |
| 0.34336979744612206 | 0.862 |
| 0.9948258855143502 | 0.863 |
| 0.17982496093824918 | 0.864 |
| 0.23662978373047538 | 0.865 |
| 0.3495454892737754 | 0.866 |
| 0.08333759413784314 | 0.867 |
| 0.4822392570233286 | 0.868 |
| 0.6067436824558535 | 0.869 |
| 0.8485720673240056 | 0.87 |
| 0.21501862236019165 | 0.871 |
| 0.23611612363178702 | 0.872 |
| 0.4375612089035673 | 0.873 |
| 0.5375587677136862 | 0.874 |
| 0.8525843439285425 | 0.875 |
| 0.5716642594047047 | 0.876 |
| 0.06912336071324943 | 0.877 |
| 0.012262951258672605 | 0.878 |
| 0.9695093212634023 | 0.879 |
| 0.47283090092531843 | 0.88 |
| 0.6711119723059064 | 0.881 |
| 0.37854389217253004 | 0.882 |
| 0.30042063225973525 | 0.883 |
| 0.4309242426428188 | 0.884 |
| 0.5175432658421101 | 0.885 |
| 0.049267463023868086 | 0.886 |
| 0.9759528520186491 | 0.887 |
| 0.6096578159701793 | 0.888 |
| 0.4241482839785138 | 0.889 |
| 0.7905572878835061 | 0.89 |
| 0.12526713404036505 | 0.891 |
| 0.8135053652008059 | 0.892 |
| 0.3412631395787248 | 0.893 |
| 0.4118964318818903 | 0.894 |
| 0.13662217498639606 | 0.895 |
| 0.049447397856851705 | 0.896 |
| 0.18803820571086516 | 0.897 |
| 0.20906168558795502 | 0.898 |
| 0.6134540573958179 | 0.899 |
| 0.881112375463212 | 0.9 |
| 0.8628642714146976 | 0.901 |
| 0.12229871707967244 | 0.902 |
| 0.015821732088196816 | 0.903 |
| 0.5622917238276657 | 0.904 |
| 0.1549948516875248 | 0.905 |
| 0.5327435983227751 | 0.906 |
| 0.2539127353054961 | 0.907 |
| 0.14241974364175014 | 0.908 |
| 0.02093943895156436 | 0.909 |
| 0.9957893757496824 | 0.91 |
| 0.471828513144137 | 0.911 |
| 0.4810497404537689 | 0.912 |
| 0.7031589673410755 | 0.913 |
| 0.6848747451491205 | 0.914 |
| 0.08655821430458366 | 0.915 |
| 0.18857800457572627 | 0.916 |
| 0.9288567564211949 | 0.917 |
| 0.1696396639746074 | 0.918 |
| 0.801192736686585 | 0.919 |
| 0.8013220102051469 | 0.92 |
| 0.9425686876943283 | 0.921 |
| 0.5848676439811847 | 0.922 |
| 0.7658955866726761 | 0.923 |
| 0.8278919062380575 | 0.924 |
| 0.20630300435734827 | 0.925 |
| 0.06569567000451915 | 0.926 |
| 0.28286065624132817 | 0.927 |
| 0.16153344739916065 | 0.928 |
| 0.1253532438921866 | 0.929 |
| 0.5642362391343895 | 0.93 |
| 0.06877748689126661 | 0.931 |
| 0.6188405194475154 | 0.932 |
| 0.3920861922341097 | 0.933 |
| 0.5461064753971799 | 0.934 |
| 0.1486374734181043 | 0.935 |
| 0.2748013144836683 | 0.936 |
| 0.3562194836504974 | 0.937 |
| 0.021787282670344243 | 0.938 |
| 0.7337069111097104 | 0.939 |
| 0.356973354035098 | 0.94 |
| 0.2843142182834759 | 0.941 |
| 0.26577616558234696 | 0.942 |
| 0.01451150743188423 | 0.943 |
| 0.3750890028567503 | 0.944 |
| 0.8994429794066117 | 0.945 |
| 0.21649531877010086 | 0.946 |
| 0.5915375865265597 | 0.947 |
| 0.9420890372296907 | 0.948 |
| 0.9630667474727382 | 0.949 |
| 0.8516792028045941 | 0.95 |
| 0.6681781914393118 | 0.951 |
| 0.1260610323996798 | 0.952 |
| 0.02689431472319226 | 0.953 |
| 0.9913992765762135 | 0.954 |
| 0.019912027573166458 | 0.955 |
| 0.607462066623728 | 0.956 |
| 0.4595437202572975 | 0.957 |
| 0.010223072533911082 | 0.958 |
| 0.8286188075199311 | 0.959 |
| 0.9599976257970445 | 0.96 |
| 0.9630909714946304 | 0.961 |
| 0.8532845590867315 | 0.962 |
| 0.8426435361105358 | 0.963 |
| 0.24387005329690914 | 0.964 |
| 0.5634587102970537 | 0.965 |
| 0.3489609283341337 | 0.966 |
| 0.5242059365875426 | 0.967 |
| 0.7126589030050476 | 0.968 |
| 0.7833676261990977 | 0.969 |
| 0.2774044192584826 | 0.97 |
| 0.3517224370889993 | 0.971 |
| 0.5547636557624752 | 0.972 |
| 0.252465381596895 | 0.973 |
| 0.4525738549575037 | 0.974 |
| 0.49305990035934033 | 0.975 |
| 0.37372713968623106 | 0.976 |
| 0.00881224687611093 | 0.977 |
| 0.515754117139416 | 0.978 |
| 0.7723540782068588 | 0.979 |
| 0.39580060221116 | 0.98 |
| 0.8661004683844078 | 0.981 |
| 0.22566881922970183 | 0.982 |
| 0.1847446190797971 | 0.983 |
| 0.43303052554313914 | 0.984 |
| 0.8573578223091624 | 0.985 |
| 0.41448336754974113 | 0.986 |
| 0.7205196216108256 | 0.987 |
| 0.8343311896107425 | 0.988 |
| 0.1789171541137896 | 0.989 |
| 0.7631066678911826 | 0.99 |
| 0.20016765091311384 | 0.991 |
| 0.29999030103741375 | 0.992 |
| 0.2439302619044308 | 0.993 |
| 0.9451041493935222 | 0.994 |
| 0.8411706313616373 | 0.995 |
| 0.1697309447656299 | 0.996 |
| 0.7708180943005437 | 0.997 |
| 0.24160004880099484 | 0.998 |
| 0.5817750320380464 | 0.999 |
| 0.3100257780917388 | 1 |